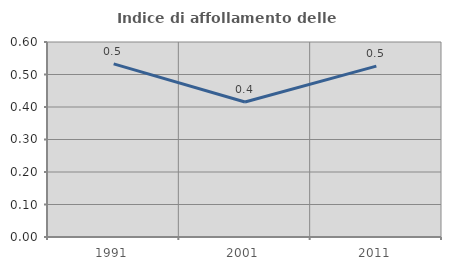
| Category | Indice di affollamento delle abitazioni  |
|---|---|
| 1991.0 | 0.533 |
| 2001.0 | 0.416 |
| 2011.0 | 0.526 |